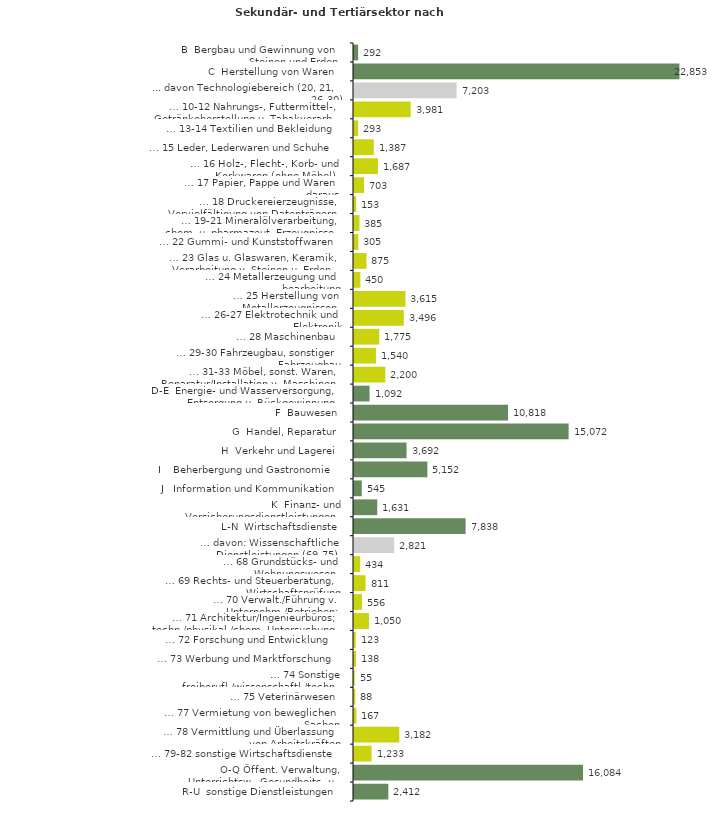
| Category | Series 0 |
|---|---|
| B  Bergbau und Gewinnung von Steinen und Erden | 292 |
| C  Herstellung von Waren | 22853 |
| ... davon Technologiebereich (20, 21, 26-30) | 7203 |
| … 10-12 Nahrungs-, Futtermittel-, Getränkeherstellung u. Tabakverarb. | 3981 |
| … 13-14 Textilien und Bekleidung | 293 |
| … 15 Leder, Lederwaren und Schuhe | 1387 |
| … 16 Holz-, Flecht-, Korb- und Korkwaren (ohne Möbel)  | 1687 |
| … 17 Papier, Pappe und Waren daraus  | 703 |
| … 18 Druckereierzeugnisse, Vervielfältigung von Datenträgern | 153 |
| … 19-21 Mineralölverarbeitung, chem. u. pharmazeut. Erzeugnisse | 385 |
| … 22 Gummi- und Kunststoffwaren | 305 |
| … 23 Glas u. Glaswaren, Keramik, Verarbeitung v. Steinen u. Erden  | 875 |
| … 24 Metallerzeugung und -bearbeitung | 450 |
| … 25 Herstellung von Metallerzeugnissen  | 3615 |
| … 26-27 Elektrotechnik und Elektronik | 3496 |
| … 28 Maschinenbau | 1775 |
| … 29-30 Fahrzeugbau, sonstiger Fahrzeugbau | 1540 |
| … 31-33 Möbel, sonst. Waren, Reparatur/Installation v. Maschinen | 2200 |
| D-E  Energie- und Wasserversorgung, Entsorgung u. Rückgewinnung | 1092 |
| F  Bauwesen | 10818 |
| G  Handel, Reparatur | 15072 |
| H  Verkehr und Lagerei | 3692 |
| I    Beherbergung und Gastronomie | 5152 |
| J   Information und Kommunikation | 545 |
| K  Finanz- und Versicherungsdienstleistungen | 1631 |
| L-N  Wirtschaftsdienste | 7838 |
| … davon: Wissenschaftliche Dienstleistungen (69-75) | 2821 |
| … 68 Grundstücks- und Wohnungswesen  | 434 |
| … 69 Rechts- und Steuerberatung, Wirtschaftsprüfung | 811 |
| … 70 Verwalt./Führung v. Unternehm./Betrieben; Unternehmensberat. | 556 |
| … 71 Architektur/Ingenieurbüros; techn./physikal./chem. Untersuchung | 1050 |
| … 72 Forschung und Entwicklung  | 123 |
| … 73 Werbung und Marktforschung | 138 |
| … 74 Sonstige freiberufl./wissenschaftl./techn. Tätigkeiten | 55 |
| … 75 Veterinärwesen | 88 |
| … 77 Vermietung von beweglichen Sachen  | 167 |
| … 78 Vermittlung und Überlassung von Arbeitskräften | 3182 |
| … 79-82 sonstige Wirtschaftsdienste | 1233 |
| O-Q Öffent. Verwaltung, Unterrichtsw., Gesundheits- u. Sozialwesen | 16084 |
| R-U  sonstige Dienstleistungen | 2412 |